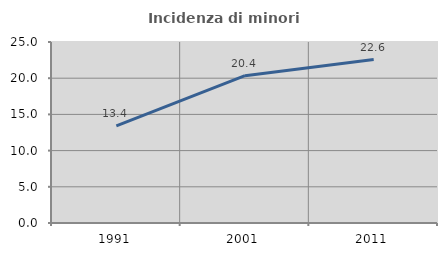
| Category | Incidenza di minori stranieri |
|---|---|
| 1991.0 | 13.406 |
| 2001.0 | 20.354 |
| 2011.0 | 22.573 |